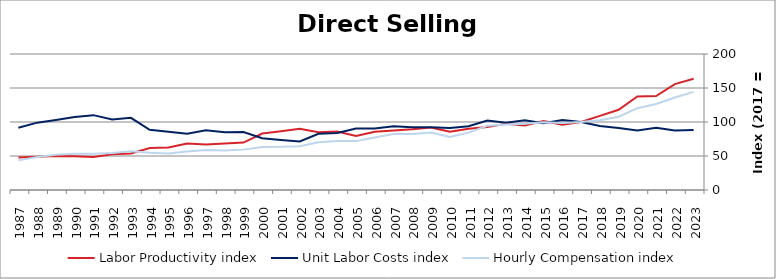
| Category | Labor Productivity index | Unit Labor Costs index | Hourly Compensation index |
|---|---|---|---|
| 2023.0 | 163.562 | 88.199 | 144.261 |
| 2022.0 | 155.73 | 87.411 | 136.125 |
| 2021.0 | 138.206 | 91.512 | 126.475 |
| 2020.0 | 137.435 | 87.527 | 120.292 |
| 2019.0 | 118.026 | 91.245 | 107.693 |
| 2018.0 | 108.967 | 94.053 | 102.487 |
| 2017.0 | 100 | 100 | 100 |
| 2016.0 | 95.94 | 102.809 | 98.635 |
| 2015.0 | 101.351 | 98.267 | 99.594 |
| 2014.0 | 94.82 | 102.646 | 97.329 |
| 2013.0 | 97.404 | 99.072 | 96.5 |
| 2012.0 | 92.586 | 102.077 | 94.509 |
| 2011.0 | 90.071 | 93.65 | 84.351 |
| 2010.0 | 85.568 | 91.039 | 77.901 |
| 2009.0 | 91.809 | 92.144 | 84.597 |
| 2008.0 | 89.415 | 92.301 | 82.531 |
| 2007.0 | 87.668 | 93.789 | 82.223 |
| 2006.0 | 85.503 | 90.273 | 77.186 |
| 2005.0 | 79.406 | 90.544 | 71.898 |
| 2004.0 | 86.005 | 83.974 | 72.222 |
| 2003.0 | 84.783 | 82.73 | 70.142 |
| 2002.0 | 90.209 | 71.469 | 64.471 |
| 2001.0 | 86.436 | 73.453 | 63.49 |
| 2000.0 | 83.069 | 75.996 | 63.129 |
| 1999.0 | 69.696 | 85.19 | 59.374 |
| 1998.0 | 68.303 | 84.924 | 58.006 |
| 1997.0 | 66.902 | 87.908 | 58.812 |
| 1996.0 | 68.319 | 82.901 | 56.637 |
| 1995.0 | 62.445 | 85.726 | 53.531 |
| 1994.0 | 61.783 | 88.53 | 54.696 |
| 1993.0 | 53.761 | 106.12 | 57.052 |
| 1992.0 | 52.592 | 103.76 | 54.57 |
| 1991.0 | 48.401 | 110.091 | 53.285 |
| 1990.0 | 49.595 | 107.306 | 53.218 |
| 1989.0 | 50.159 | 103.02 | 51.674 |
| 1988.0 | 49.002 | 99.039 | 48.531 |
| 1987.0 | 47.668 | 91.443 | 43.589 |